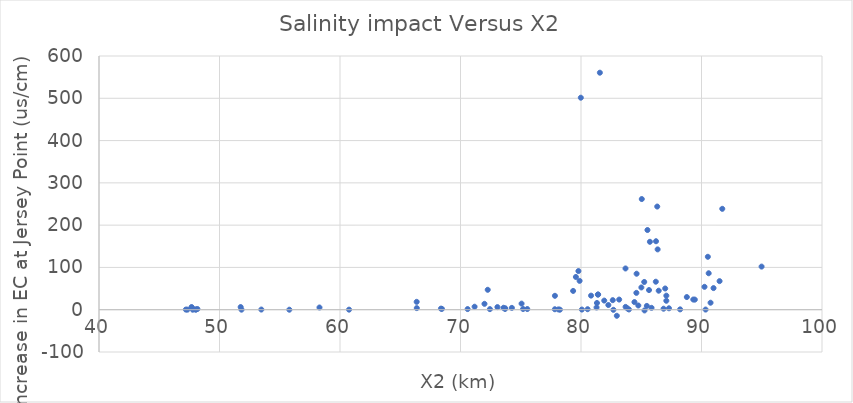
| Category | Series 0 |
|---|---|
| 73.568 | 4.577 |
| 82.689 | -0.251 |
| 84.436 | 18.057 |
| 81.291 | 5.272 |
| 82.636 | 22.617 |
| 71.99 | 13.933 |
| 73.711 | 3.37 |
| 71.169 | 7.082 |
| 94.987 | 101.965 |
| 75.069 | 14.42 |
| 88.782 | 29.951 |
| 68.379 | 2.59 |
| 90.339 | 0.362 |
| 83.847 | 3.118 |
| 91.724 | 238.603 |
| 90.752 | 16.527 |
| 86.209 | 66.212 |
| 83.701 | 6.656 |
| 55.795 | 0.006 |
| 72.441 | 1.372 |
| 83.978 | 0.602 |
| 78.251 | 0.059 |
| 77.83 | 1.117 |
| 86.36 | 142.665 |
| 80.835 | 33.295 |
| 75.541 | 1.603 |
| 85.273 | -1.719 |
| 48.168 | 1.673 |
| 85.464 | 8.964 |
| 84.595 | 39.859 |
| 86.448 | 44.946 |
| 82.973 | -14.375 |
| 90.596 | 86.218 |
| 85.248 | 65.627 |
| 79.985 | 501.367 |
| 85.044 | 261.69 |
| 47.714 | 4.733 |
| 86.987 | 50.175 |
| 87.082 | 33.246 |
| 89.446 | 23.867 |
| 83.168 | 23.989 |
| 81.929 | 21.585 |
| 90.249 | 54.147 |
| 72.26 | 47.097 |
| 68.459 | 1.924 |
| 79.575 | 77.465 |
| 85.718 | 160.586 |
| 79.347 | 44.427 |
| 77.837 | 32.886 |
| 86.225 | 161.926 |
| 51.757 | 6.313 |
| 87.301 | 3.339 |
| 88.226 | 0.818 |
| 81.566 | 560.51 |
| 86.327 | 243.969 |
| 47.68 | 6.304 |
| 80.549 | 1.223 |
| 60.75 | 0.135 |
| 70.592 | 1.552 |
| 85.01 | 52.65 |
| 78.127 | 0.773 |
| 48.013 | 0.151 |
| 82.27 | 11.075 |
| 84.614 | 85.1 |
| 73.696 | 1.791 |
| 79.884 | 68.234 |
| 91.5 | 67.601 |
| 48.055 | 0.539 |
| 81.398 | 35.794 |
| 47.779 | 0.035 |
| 66.364 | 18.615 |
| 47.335 | 0.138 |
| 79.786 | 91.429 |
| 66.372 | 3.779 |
| 73.064 | 6.185 |
| 81.422 | 35.977 |
| 83.693 | 97.541 |
| 85.645 | 46.472 |
| 89.318 | 24.098 |
| 85.854 | 4.443 |
| 58.298 | 5.246 |
| 84.757 | 9.967 |
| 86.853 | 2.362 |
| 75.194 | 1.683 |
| 53.471 | 0.392 |
| 80.072 | 0.386 |
| 47.208 | 0.315 |
| 85.515 | 188.471 |
| 51.827 | 0.117 |
| 74.262 | 4.339 |
| 87.081 | 21.171 |
| 81.324 | 15.918 |
| 90.527 | 125.161 |
| 90.998 | 51.135 |